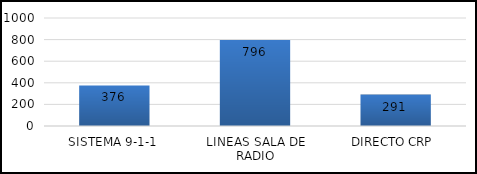
| Category | TOTAL |
|---|---|
| SISTEMA 9-1-1 | 376 |
| LINEAS SALA DE RADIO | 796 |
| DIRECTO CRP  | 291 |